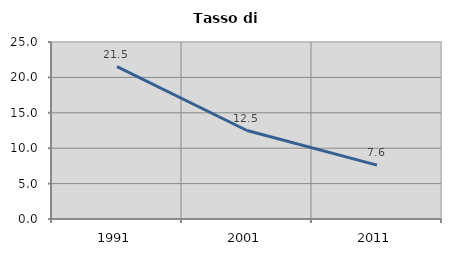
| Category | Tasso di disoccupazione   |
|---|---|
| 1991.0 | 21.529 |
| 2001.0 | 12.497 |
| 2011.0 | 7.606 |